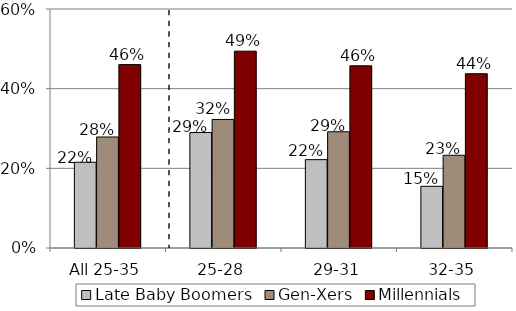
| Category | Late Baby Boomers | Gen-Xers | Millennials |
|---|---|---|---|
| All 25-35 | 0.215 | 0.279 | 0.46 |
| 25-28 | 0.29 | 0.323 | 0.494 |
| 29-31 | 0.222 | 0.292 | 0.457 |
| 32-35 | 0.155 | 0.233 | 0.438 |